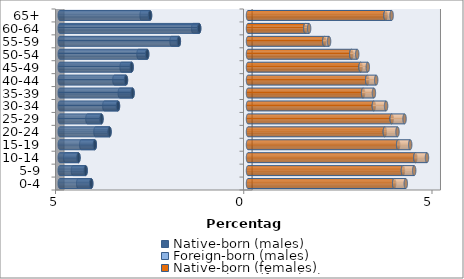
| Category | Native-born (males) | Foreign-born (males) | Native-born (females) | Foreign-born (females) |
|---|---|---|---|---|
| 0-4 | -4.164 | -0.346 | 3.883 | 0.308 |
| 5-9 | -4.313 | -0.337 | 4.115 | 0.299 |
| 10-14 | -4.503 | -0.352 | 4.445 | 0.309 |
| 15-19 | -4.069 | -0.361 | 3.988 | 0.32 |
| 20-24 | -3.678 | -0.373 | 3.635 | 0.336 |
| 25-29 | -3.892 | -0.373 | 3.818 | 0.34 |
| 30-34 | -3.454 | -0.363 | 3.342 | 0.325 |
| 35-39 | -3.066 | -0.339 | 3.057 | 0.288 |
| 40-44 | -3.242 | -0.307 | 3.166 | 0.239 |
| 45-49 | -3.091 | -0.266 | 2.99 | 0.192 |
| 50-54 | -2.678 | -0.23 | 2.744 | 0.157 |
| 55-59 | -1.836 | -0.193 | 2.026 | 0.127 |
| 60-64 | -1.297 | -0.159 | 1.524 | 0.099 |
| 65+ | -2.602 | -0.225 | 3.653 | 0.162 |